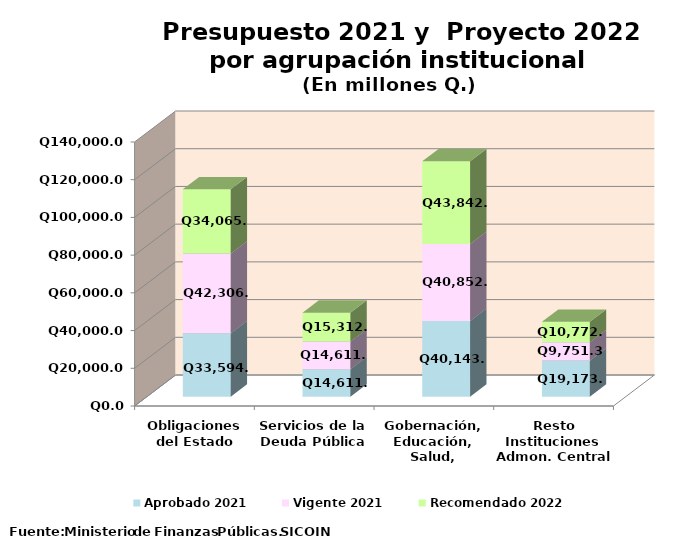
| Category | Aprobado 2021 | Vigente 2021 | Recomendado 2022 |
|---|---|---|---|
| Obligaciones del Estado | 33594.1 | 42306.4 | 34065.7 |
| Servicios de la Deuda Pública | 14611 | 14611 | 15312 |
| Gobernación, Educación, Salud, Comunicaciones | 40143.3 | 40852.8 | 43842.3 |
| Resto Instituciones Admon. Central | 19173.1 | 9751.3 | 10772.6 |